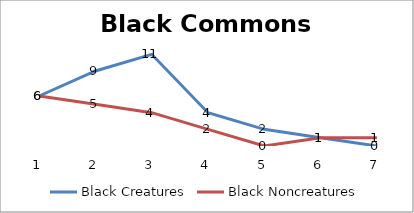
| Category | Black Creatures | Black Noncreatures |
|---|---|---|
| 0 | 6 | 6 |
| 1 | 9 | 5 |
| 2 | 11 | 4 |
| 3 | 4 | 2 |
| 4 | 2 | 0 |
| 5 | 1 | 1 |
| 6 | 0 | 1 |